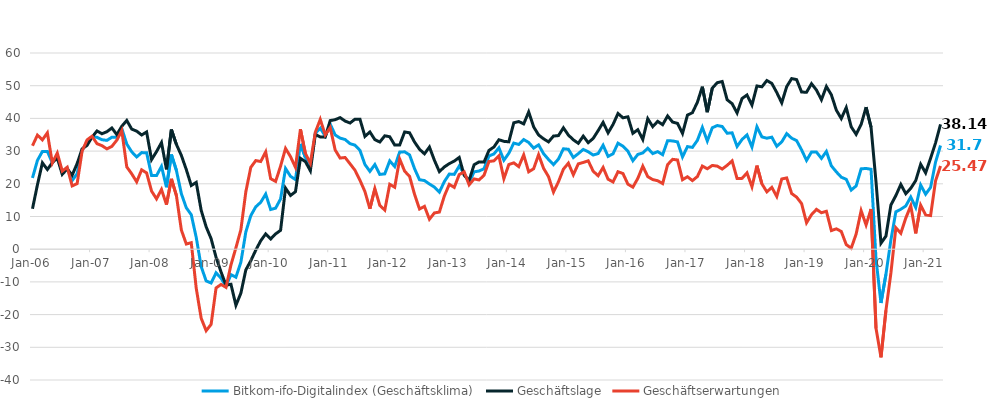
| Category | Bitkom-ifo-Digitalindex (Geschäftsklima) | Geschäftslage | Geschäftserwartungen |
|---|---|---|---|
| 2006-01-01 | 21.79 | 12.36 | 31.64 |
| 2006-02-01 | 27.17 | 19.71 | 34.89 |
| 2006-03-01 | 29.9 | 26.42 | 33.44 |
| 2006-04-01 | 29.91 | 24.37 | 35.59 |
| 2006-05-01 | 26.41 | 26.46 | 26.36 |
| 2006-06-01 | 28.66 | 27.9 | 29.41 |
| 2006-07-01 | 23.38 | 22.89 | 23.88 |
| 2006-08-01 | 24.81 | 24.56 | 25.07 |
| 2006-09-01 | 21 | 22.65 | 19.35 |
| 2006-10-01 | 23.1 | 26.19 | 20.06 |
| 2006-11-01 | 30.33 | 30.66 | 29.99 |
| 2006-12-01 | 32.59 | 31.75 | 33.43 |
| 2007-01-01 | 34.42 | 34.28 | 34.55 |
| 2007-02-01 | 34.21 | 36.16 | 32.27 |
| 2007-03-01 | 33.48 | 35.31 | 31.67 |
| 2007-04-01 | 33.28 | 35.93 | 30.67 |
| 2007-05-01 | 34.24 | 37.07 | 31.45 |
| 2007-06-01 | 34.19 | 35.03 | 33.35 |
| 2007-07-01 | 36.92 | 37.59 | 36.25 |
| 2007-08-01 | 32.16 | 39.37 | 25.17 |
| 2007-09-01 | 29.78 | 36.73 | 23.05 |
| 2007-10-01 | 28.21 | 36.1 | 20.59 |
| 2007-11-01 | 29.54 | 34.93 | 24.27 |
| 2007-12-01 | 29.5 | 35.85 | 23.33 |
| 2008-01-01 | 22.53 | 27.39 | 17.77 |
| 2008-02-01 | 22.51 | 29.85 | 15.39 |
| 2008-03-01 | 25.33 | 32.61 | 18.27 |
| 2008-04-01 | 18.96 | 24.43 | 13.63 |
| 2008-05-01 | 28.93 | 36.59 | 21.51 |
| 2008-06-01 | 24.11 | 32.06 | 16.44 |
| 2008-07-01 | 16.99 | 28.7 | 5.89 |
| 2008-08-01 | 12.66 | 24.35 | 1.58 |
| 2008-09-01 | 10.55 | 19.48 | 1.99 |
| 2008-10-01 | 3.61 | 20.43 | -11.93 |
| 2008-11-01 | -5.32 | 11.89 | -21.13 |
| 2008-12-01 | -9.7 | 6.85 | -24.92 |
| 2009-01-01 | -10.34 | 3.22 | -22.99 |
| 2009-02-01 | -7.22 | -2.49 | -11.85 |
| 2009-03-01 | -8.88 | -6.96 | -10.78 |
| 2009-04-01 | -11.33 | -11 | -11.66 |
| 2009-05-01 | -7.79 | -10.73 | -4.8 |
| 2009-06-01 | -8.57 | -17.16 | 0.43 |
| 2009-07-01 | -3.98 | -13.44 | 5.97 |
| 2009-08-01 | 5.3 | -6.31 | 17.6 |
| 2009-09-01 | 10.27 | -3.53 | 25.03 |
| 2009-10-01 | 12.96 | -0.29 | 27.1 |
| 2009-11-01 | 14.35 | 2.58 | 26.81 |
| 2009-12-01 | 16.86 | 4.68 | 29.77 |
| 2010-01-01 | 12.14 | 3.12 | 21.57 |
| 2010-02-01 | 12.55 | 4.68 | 20.73 |
| 2010-03-01 | 15.37 | 5.78 | 25.41 |
| 2010-04-01 | 24.67 | 18.68 | 30.82 |
| 2010-05-01 | 22.29 | 16.43 | 28.31 |
| 2010-06-01 | 21.28 | 17.59 | 25.03 |
| 2010-07-01 | 32.19 | 27.78 | 36.69 |
| 2010-08-01 | 28.03 | 26.79 | 29.27 |
| 2010-09-01 | 25.11 | 23.99 | 26.24 |
| 2010-10-01 | 35.42 | 35.07 | 35.76 |
| 2010-11-01 | 37 | 34.34 | 39.69 |
| 2010-12-01 | 34.6 | 34.26 | 34.94 |
| 2011-01-01 | 38.27 | 39.32 | 37.22 |
| 2011-02-01 | 34.94 | 39.61 | 30.35 |
| 2011-03-01 | 33.97 | 40.24 | 27.87 |
| 2011-04-01 | 33.55 | 39.19 | 28.05 |
| 2011-05-01 | 32.27 | 38.59 | 26.12 |
| 2011-06-01 | 31.82 | 39.77 | 24.14 |
| 2011-07-01 | 30.22 | 39.75 | 21.07 |
| 2011-08-01 | 25.9 | 34.5 | 17.62 |
| 2011-09-01 | 23.8 | 35.85 | 12.36 |
| 2011-10-01 | 25.88 | 33.5 | 18.52 |
| 2011-11-01 | 22.87 | 32.78 | 13.38 |
| 2011-12-01 | 23.04 | 34.68 | 11.97 |
| 2012-01-01 | 27.01 | 34.39 | 19.85 |
| 2012-02-01 | 25.29 | 31.84 | 18.94 |
| 2012-03-01 | 29.7 | 31.85 | 27.58 |
| 2012-04-01 | 29.78 | 35.85 | 23.87 |
| 2012-05-01 | 28.83 | 35.6 | 22.26 |
| 2012-06-01 | 24.62 | 32.77 | 16.77 |
| 2012-07-01 | 21.24 | 30.56 | 12.29 |
| 2012-08-01 | 20.99 | 29.17 | 13.1 |
| 2012-09-01 | 19.93 | 31.24 | 9.17 |
| 2012-10-01 | 19 | 27.2 | 11.1 |
| 2012-11-01 | 17.45 | 23.73 | 11.35 |
| 2012-12-01 | 20.66 | 25.15 | 16.25 |
| 2013-01-01 | 22.98 | 26.17 | 19.83 |
| 2013-02-01 | 22.88 | 26.94 | 18.9 |
| 2013-03-01 | 25.42 | 28.06 | 22.82 |
| 2013-04-01 | 23.13 | 22.6 | 23.66 |
| 2013-05-01 | 20.37 | 21.06 | 19.69 |
| 2013-06-01 | 23.65 | 25.83 | 21.5 |
| 2013-07-01 | 23.91 | 26.69 | 21.17 |
| 2013-08-01 | 24.61 | 26.63 | 22.61 |
| 2013-09-01 | 28.52 | 30.22 | 26.83 |
| 2013-10-01 | 29.13 | 31.26 | 27.02 |
| 2013-11-01 | 31 | 33.48 | 28.55 |
| 2013-12-01 | 27.2 | 32.98 | 21.55 |
| 2014-01-01 | 29.34 | 32.84 | 25.89 |
| 2014-02-01 | 32.45 | 38.66 | 26.4 |
| 2014-03-01 | 32.04 | 39.04 | 25.26 |
| 2014-04-01 | 33.53 | 38.32 | 28.85 |
| 2014-05-01 | 32.64 | 41.97 | 23.67 |
| 2014-06-01 | 30.92 | 37.41 | 24.6 |
| 2014-07-01 | 31.9 | 34.93 | 28.9 |
| 2014-08-01 | 29.21 | 33.76 | 24.74 |
| 2014-09-01 | 27.44 | 32.82 | 22.19 |
| 2014-10-01 | 25.87 | 34.6 | 17.47 |
| 2014-11-01 | 27.57 | 34.74 | 20.61 |
| 2014-12-01 | 30.71 | 37.12 | 24.47 |
| 2015-01-01 | 30.56 | 34.9 | 26.31 |
| 2015-02-01 | 28.04 | 33.45 | 22.76 |
| 2015-03-01 | 29.23 | 32.39 | 26.1 |
| 2015-04-01 | 30.52 | 34.58 | 26.53 |
| 2015-05-01 | 29.79 | 32.58 | 27.04 |
| 2015-06-01 | 28.8 | 33.87 | 23.85 |
| 2015-07-01 | 29.25 | 36.26 | 22.46 |
| 2015-08-01 | 31.79 | 38.78 | 25 |
| 2015-09-01 | 28.38 | 35.58 | 21.41 |
| 2015-10-01 | 29.18 | 38.13 | 20.56 |
| 2015-11-01 | 32.42 | 41.5 | 23.69 |
| 2015-12-01 | 31.5 | 40.18 | 23.14 |
| 2016-01-01 | 29.95 | 40.48 | 19.88 |
| 2016-02-01 | 27.06 | 35.44 | 18.98 |
| 2016-03-01 | 28.98 | 36.54 | 21.67 |
| 2016-04-01 | 29.44 | 33.55 | 25.4 |
| 2016-05-01 | 30.88 | 39.91 | 22.19 |
| 2016-06-01 | 29.24 | 37.48 | 21.29 |
| 2016-07-01 | 29.84 | 39.09 | 20.94 |
| 2016-08-01 | 28.9 | 38.08 | 20.07 |
| 2016-09-01 | 33.19 | 40.75 | 25.86 |
| 2016-10-01 | 33.11 | 38.89 | 27.48 |
| 2016-11-01 | 32.81 | 38.47 | 27.29 |
| 2016-12-01 | 28.21 | 35.39 | 21.25 |
| 2017-01-01 | 31.38 | 41 | 22.15 |
| 2017-02-01 | 31.13 | 41.75 | 20.98 |
| 2017-03-01 | 33.29 | 44.93 | 22.21 |
| 2017-04-01 | 37.25 | 49.7 | 25.43 |
| 2017-05-01 | 33.09 | 41.9 | 24.6 |
| 2017-06-01 | 37.13 | 49.24 | 25.61 |
| 2017-07-01 | 37.82 | 50.92 | 25.41 |
| 2017-08-01 | 37.52 | 51.28 | 24.51 |
| 2017-09-01 | 35.46 | 45.69 | 25.65 |
| 2017-10-01 | 35.59 | 44.5 | 27.01 |
| 2017-11-01 | 31.42 | 41.67 | 21.61 |
| 2017-12-01 | 33.55 | 46.08 | 21.66 |
| 2018-01-01 | 34.95 | 47.16 | 23.34 |
| 2018-02-01 | 31.24 | 44.09 | 19.08 |
| 2018-03-01 | 37.43 | 49.92 | 25.57 |
| 2018-04-01 | 34.35 | 49.66 | 19.99 |
| 2018-05-01 | 33.94 | 51.58 | 17.54 |
| 2018-06-01 | 34.26 | 50.7 | 18.91 |
| 2018-07-01 | 31.47 | 47.92 | 16.12 |
| 2018-08-01 | 32.82 | 44.75 | 21.47 |
| 2018-09-01 | 35.35 | 49.72 | 21.8 |
| 2018-10-01 | 33.94 | 52.18 | 17.02 |
| 2018-11-01 | 33.2 | 51.86 | 15.92 |
| 2018-12-01 | 30.38 | 48.06 | 13.96 |
| 2019-01-01 | 27.16 | 48 | 8.08 |
| 2019-02-01 | 29.71 | 50.61 | 10.57 |
| 2019-03-01 | 29.7 | 48.67 | 12.18 |
| 2019-04-01 | 27.77 | 45.7 | 11.15 |
| 2019-05-01 | 29.89 | 49.76 | 11.6 |
| 2019-06-01 | 25.5 | 47.22 | 5.69 |
| 2019-07-01 | 23.65 | 42.54 | 6.23 |
| 2019-08-01 | 22.02 | 39.96 | 5.43 |
| 2019-09-01 | 21.37 | 43.31 | 1.41 |
| 2019-10-01 | 18.08 | 37.43 | 0.3 |
| 2019-11-01 | 19.36 | 35.12 | 4.66 |
| 2019-12-01 | 24.57 | 38.14 | 11.78 |
| 2020-01-01 | 24.7 | 43.43 | 7.41 |
| 2020-02-01 | 24.44 | 37.29 | 12.29 |
| 2020-03-01 | -3.08 | 20.58 | -24.2 |
| 2020-04-01 | -16.45 | 1.83 | -33.07 |
| 2020-05-01 | -7.67 | 4.02 | -18.69 |
| 2020-06-01 | 2.85 | 13.51 | -7.28 |
| 2020-07-01 | 11.43 | 16.4 | 6.57 |
| 2020-08-01 | 12.21 | 19.81 | 4.87 |
| 2020-09-01 | 13.2 | 16.96 | 9.5 |
| 2020-10-01 | 15.94 | 18.65 | 13.26 |
| 2020-11-01 | 12.76 | 20.99 | 4.84 |
| 2020-12-01 | 19.64 | 25.99 | 13.47 |
| 2021-01-01 | 16.83 | 23.37 | 10.47 |
| 2021-02-01 | 18.89 | 27.83 | 10.29 |
| 2021-03-01 | 26.65 | 32.52 | 20.92 |
| 2021-04-01 | 31.72 | 38.14 | 25.47 |